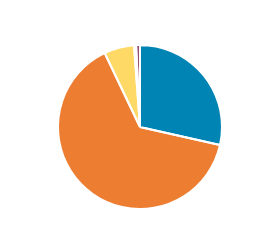
| Category | Series 0 |
|---|---|
| PC/MC | 1195 |
| CAR/LGV | 2697 |
| OGV1 & PSV 2Axle | 248 |
| OGV1 & PSV 3 Axle | 17 |
| OGV2 | 32 |